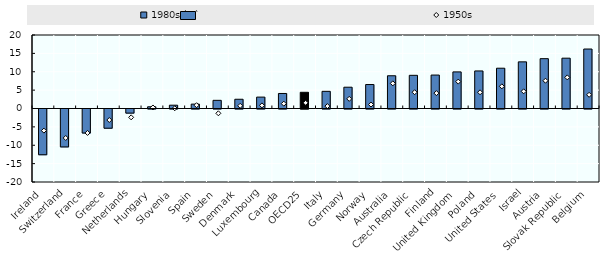
| Category | 1980s (↗) |
|---|---|
| Ireland | -12.45 |
| Switzerland | -10.32 |
| France | -6.54 |
| Greece | -5.23 |
| Netherlands | -1.12 |
| Hungary | 0.47 |
| Slovenia | 0.9 |
| Spain | 1.193 |
| Sweden | 2.223 |
| Denmark | 2.515 |
| Luxembourg | 3.1 |
| Canada | 4.09 |
| OECD25 | 4.405 |
| Italy | 4.67 |
| Germany | 5.795 |
| Norway | 6.523 |
| Australia | 8.91 |
| Czech Republic | 9.03 |
| Finland | 9.1 |
| United Kingdom | 9.96 |
| Poland | 10.22 |
| United States | 10.963 |
| Israel | 12.692 |
| Austria | 13.56 |
| Slovak Republic | 13.693 |
| Belgium | 16.186 |